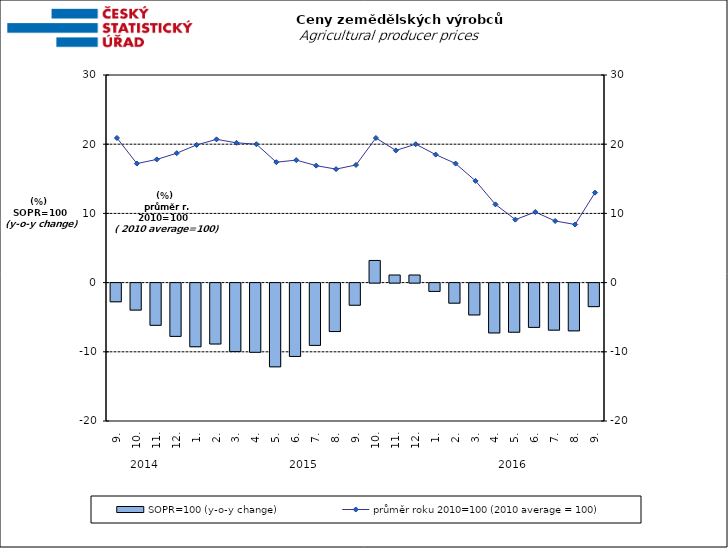
| Category | SOPR=100 (y-o-y change)   |
|---|---|
| 0 | -2.7 |
| 1 | -3.9 |
| 2 | -6.1 |
| 3 | -7.7 |
| 4 | -9.2 |
| 5 | -8.8 |
| 6 | -9.9 |
| 7 | -10 |
| 8 | -12.1 |
| 9 | -10.6 |
| 10 | -9 |
| 11 | -7 |
| 12 | -3.2 |
| 13 | 3.2 |
| 14 | 1.1 |
| 15 | 1.1 |
| 16 | -1.2 |
| 17 | -2.9 |
| 18 | -4.6 |
| 19 | -7.2 |
| 20 | -7.1 |
| 21 | -6.4 |
| 22 | -6.8 |
| 23 | -6.9 |
| 24 | -3.4 |